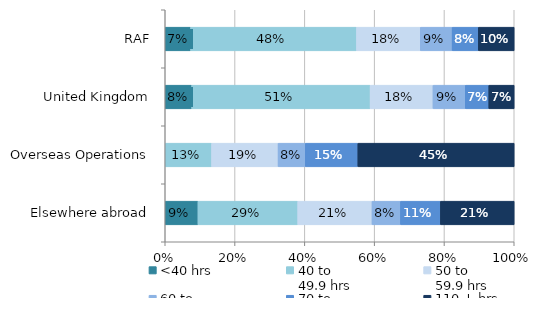
| Category | <40 hrs | 40 to 
49.9 hrs | 50 to 
59.9 hrs | 60 to 
69.9 hrs | 70 to 
109.9 hrs | 110 + hrs |
|---|---|---|---|---|---|---|
| RAF | 0.073 | 0.476 | 0.183 | 0.091 | 0.075 | 0.103 |
| United Kingdom | 0.076 | 0.511 | 0.18 | 0.093 | 0.067 | 0.073 |
| Overseas Operations | 0 | 0.133 | 0.19 | 0.078 | 0.151 | 0.448 |
| Elsewhere abroad | 0.094 | 0.286 | 0.213 | 0.081 | 0.115 | 0.211 |